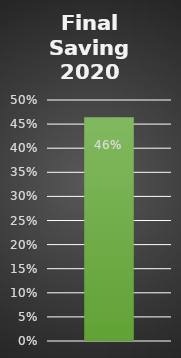
| Category | Series 0 |
|---|---|
| 0 | 0.464 |